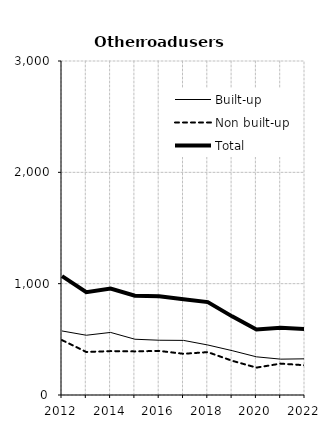
| Category | Built-up | Non built-up | Total |
|---|---|---|---|
| 2012.0 | 575.2 | 493.2 | 1068.3 |
| 2013.0 | 536.8 | 386.5 | 923.4 |
| 2014.0 | 562 | 394.2 | 956.3 |
| 2015.0 | 500.9 | 391.7 | 892.4 |
| 2016.0 | 491.8 | 396.1 | 887.6 |
| 2017.0 | 490.5 | 370.1 | 860.7 |
| 2018.0 | 449.2 | 385.1 | 834.3 |
| 2019.0 | 398.5 | 307.7 | 706.2 |
| 2020.0 | 343 | 246 | 589 |
| 2021.0 | 322 | 282 | 604 |
| 2022.0 | 325 | 267 | 592 |